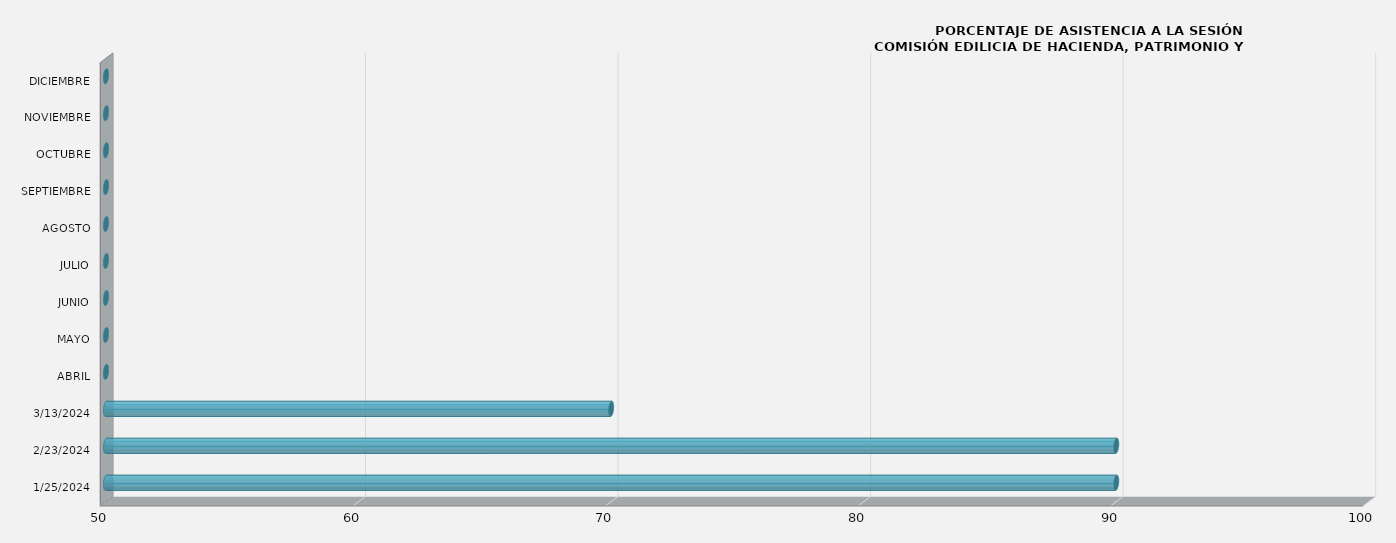
| Category | Series 0 |
|---|---|
| 25/01/2024 | 90 |
| 23/02/2024 | 90 |
| 13/03/2024 | 70 |
| ABRIL | 0 |
| MAYO | 0 |
| JUNIO | 0 |
| JULIO | 0 |
| AGOSTO | 0 |
| SEPTIEMBRE | 0 |
| OCTUBRE | 0 |
| NOVIEMBRE | 0 |
| DICIEMBRE | 0 |